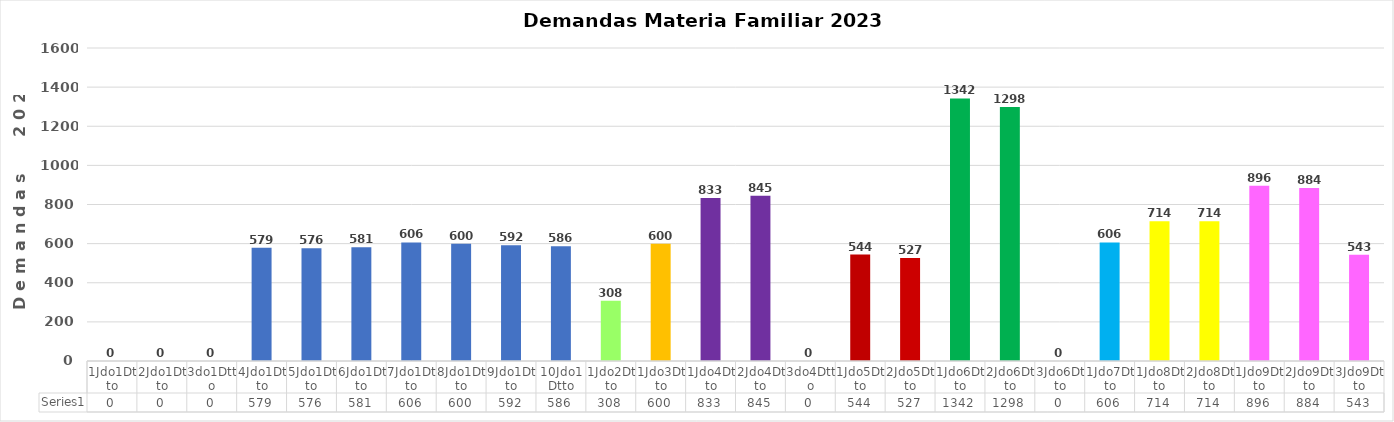
| Category | Series 0 |
|---|---|
| 1Jdo1Dtto | 0 |
| 2Jdo1Dtto | 0 |
| 3do1Dtto | 0 |
| 4Jdo1Dtto | 579 |
| 5Jdo1Dtto | 576 |
| 6Jdo1Dtto | 581 |
| 7Jdo1Dtto | 606 |
| 8Jdo1Dtto | 600 |
| 9Jdo1Dtto | 592 |
| 10Jdo1Dtto | 586 |
| 1Jdo2Dtto | 308 |
| 1Jdo3Dtto | 600 |
| 1Jdo4Dtto | 833 |
| 2Jdo4Dtto | 845 |
| 3do4Dtto | 0 |
| 1Jdo5Dtto | 544 |
| 2Jdo5Dtto | 527 |
| 1Jdo6Dtto | 1342 |
| 2Jdo6Dtto | 1298 |
| 3Jdo6Dtto | 0 |
| 1Jdo7Dtto | 606 |
| 1Jdo8Dtto | 714 |
| 2Jdo8Dtto | 714 |
| 1Jdo9Dtto | 896 |
| 2Jdo9Dtto | 884 |
| 3Jdo9Dtto | 543 |